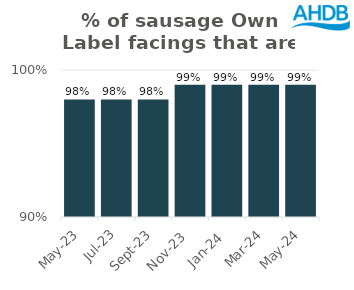
| Category | Sausage |
|---|---|
| 2023-05-01 | 0.98 |
| 2023-07-01 | 0.98 |
| 2023-09-01 | 0.98 |
| 2023-11-01 | 0.99 |
| 2024-01-01 | 0.99 |
| 2024-03-01 | 0.99 |
| 2024-05-01 | 0.99 |